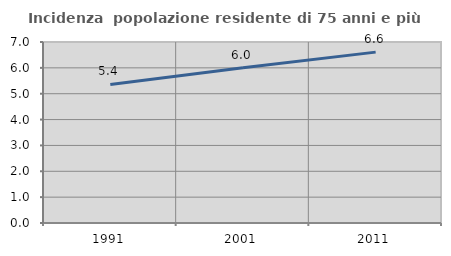
| Category | Incidenza  popolazione residente di 75 anni e più |
|---|---|
| 1991.0 | 5.358 |
| 2001.0 | 6.006 |
| 2011.0 | 6.608 |